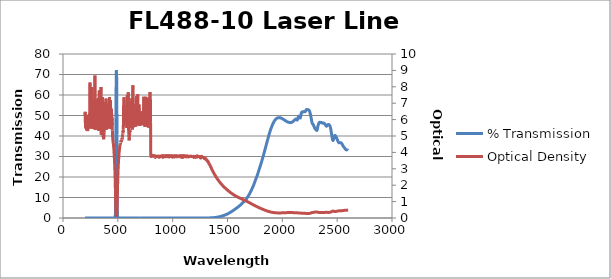
| Category | % Transmission |
|---|---|
| 2600.0 | 32.931 |
| 2599.0 | 32.979 |
| 2598.0 | 33.02 |
| 2597.0 | 33.05 |
| 2596.0 | 33.079 |
| 2595.0 | 33.104 |
| 2594.0 | 33.125 |
| 2593.0 | 33.148 |
| 2592.0 | 33.171 |
| 2591.0 | 33.188 |
| 2590.0 | 33.199 |
| 2589.0 | 33.204 |
| 2588.0 | 33.206 |
| 2587.0 | 33.207 |
| 2586.0 | 33.225 |
| 2585.0 | 33.237 |
| 2584.0 | 33.252 |
| 2583.0 | 33.273 |
| 2582.0 | 33.294 |
| 2581.0 | 33.32 |
| 2580.0 | 33.357 |
| 2579.0 | 33.407 |
| 2578.0 | 33.458 |
| 2577.0 | 33.515 |
| 2576.0 | 33.574 |
| 2575.0 | 33.638 |
| 2574.0 | 33.709 |
| 2573.0 | 33.794 |
| 2572.0 | 33.872 |
| 2571.0 | 33.949 |
| 2570.0 | 34.018 |
| 2569.0 | 34.081 |
| 2568.0 | 34.137 |
| 2567.0 | 34.196 |
| 2566.0 | 34.258 |
| 2565.0 | 34.32 |
| 2564.0 | 34.395 |
| 2563.0 | 34.468 |
| 2562.0 | 34.547 |
| 2561.0 | 34.618 |
| 2560.0 | 34.696 |
| 2559.0 | 34.767 |
| 2558.0 | 34.826 |
| 2557.0 | 34.89 |
| 2556.0 | 34.951 |
| 2555.0 | 35.021 |
| 2554.0 | 35.103 |
| 2553.0 | 35.191 |
| 2552.0 | 35.299 |
| 2551.0 | 35.409 |
| 2550.0 | 35.522 |
| 2549.0 | 35.629 |
| 2548.0 | 35.739 |
| 2547.0 | 35.849 |
| 2546.0 | 35.949 |
| 2545.0 | 36.046 |
| 2544.0 | 36.144 |
| 2543.0 | 36.235 |
| 2542.0 | 36.316 |
| 2541.0 | 36.394 |
| 2540.0 | 36.465 |
| 2539.0 | 36.526 |
| 2538.0 | 36.575 |
| 2537.0 | 36.626 |
| 2536.0 | 36.668 |
| 2535.0 | 36.699 |
| 2534.0 | 36.731 |
| 2533.0 | 36.75 |
| 2532.0 | 36.759 |
| 2531.0 | 36.76 |
| 2530.0 | 36.757 |
| 2529.0 | 36.748 |
| 2528.0 | 36.743 |
| 2527.0 | 36.736 |
| 2526.0 | 36.722 |
| 2525.0 | 36.717 |
| 2524.0 | 36.705 |
| 2523.0 | 36.699 |
| 2522.0 | 36.687 |
| 2521.0 | 36.68 |
| 2520.0 | 36.674 |
| 2519.0 | 36.674 |
| 2518.0 | 36.682 |
| 2517.0 | 36.692 |
| 2516.0 | 36.722 |
| 2515.0 | 36.753 |
| 2514.0 | 36.808 |
| 2513.0 | 36.857 |
| 2512.0 | 36.932 |
| 2511.0 | 37.014 |
| 2510.0 | 37.102 |
| 2509.0 | 37.205 |
| 2508.0 | 37.316 |
| 2507.0 | 37.436 |
| 2506.0 | 37.552 |
| 2505.0 | 37.694 |
| 2504.0 | 37.824 |
| 2503.0 | 37.965 |
| 2502.0 | 38.11 |
| 2501.0 | 38.254 |
| 2500.0 | 38.384 |
| 2499.0 | 38.514 |
| 2498.0 | 38.643 |
| 2497.0 | 38.751 |
| 2496.0 | 38.876 |
| 2495.0 | 38.981 |
| 2494.0 | 39.095 |
| 2493.0 | 39.186 |
| 2492.0 | 39.297 |
| 2491.0 | 39.389 |
| 2490.0 | 39.494 |
| 2489.0 | 39.596 |
| 2488.0 | 39.701 |
| 2487.0 | 39.801 |
| 2486.0 | 39.901 |
| 2485.0 | 40.003 |
| 2484.0 | 40.08 |
| 2483.0 | 40.166 |
| 2482.0 | 40.212 |
| 2481.0 | 40.249 |
| 2480.0 | 40.239 |
| 2479.0 | 40.225 |
| 2478.0 | 40.167 |
| 2477.0 | 40.09 |
| 2476.0 | 39.986 |
| 2475.0 | 39.868 |
| 2474.0 | 39.734 |
| 2473.0 | 39.576 |
| 2472.0 | 39.411 |
| 2471.0 | 39.221 |
| 2470.0 | 39.035 |
| 2469.0 | 38.821 |
| 2468.0 | 38.622 |
| 2467.0 | 38.41 |
| 2466.0 | 38.221 |
| 2465.0 | 38.041 |
| 2464.0 | 37.901 |
| 2463.0 | 37.807 |
| 2462.0 | 37.782 |
| 2461.0 | 37.809 |
| 2460.0 | 37.91 |
| 2459.0 | 38.071 |
| 2458.0 | 38.278 |
| 2457.0 | 38.533 |
| 2456.0 | 38.81 |
| 2455.0 | 39.1 |
| 2454.0 | 39.387 |
| 2453.0 | 39.696 |
| 2452.0 | 39.993 |
| 2451.0 | 40.307 |
| 2450.0 | 40.632 |
| 2449.0 | 40.955 |
| 2448.0 | 41.278 |
| 2447.0 | 41.609 |
| 2446.0 | 41.954 |
| 2445.0 | 42.287 |
| 2444.0 | 42.629 |
| 2443.0 | 42.957 |
| 2442.0 | 43.245 |
| 2441.0 | 43.528 |
| 2440.0 | 43.786 |
| 2439.0 | 44.015 |
| 2438.0 | 44.227 |
| 2437.0 | 44.417 |
| 2436.0 | 44.586 |
| 2435.0 | 44.724 |
| 2434.0 | 44.859 |
| 2433.0 | 44.972 |
| 2432.0 | 45.068 |
| 2431.0 | 45.163 |
| 2430.0 | 45.249 |
| 2429.0 | 45.314 |
| 2428.0 | 45.381 |
| 2427.0 | 45.442 |
| 2426.0 | 45.493 |
| 2425.0 | 45.531 |
| 2424.0 | 45.565 |
| 2423.0 | 45.593 |
| 2422.0 | 45.608 |
| 2421.0 | 45.621 |
| 2420.0 | 45.632 |
| 2419.0 | 45.631 |
| 2418.0 | 45.623 |
| 2417.0 | 45.612 |
| 2416.0 | 45.594 |
| 2415.0 | 45.563 |
| 2414.0 | 45.525 |
| 2413.0 | 45.477 |
| 2412.0 | 45.415 |
| 2411.0 | 45.341 |
| 2410.0 | 45.258 |
| 2409.0 | 45.171 |
| 2408.0 | 45.079 |
| 2407.0 | 44.993 |
| 2406.0 | 44.913 |
| 2405.0 | 44.843 |
| 2404.0 | 44.804 |
| 2403.0 | 44.784 |
| 2402.0 | 44.782 |
| 2401.0 | 44.819 |
| 2400.0 | 44.855 |
| 2399.0 | 44.925 |
| 2398.0 | 44.999 |
| 2397.0 | 45.083 |
| 2396.0 | 45.159 |
| 2395.0 | 45.252 |
| 2394.0 | 45.319 |
| 2393.0 | 45.403 |
| 2392.0 | 45.466 |
| 2391.0 | 45.548 |
| 2390.0 | 45.607 |
| 2389.0 | 45.688 |
| 2388.0 | 45.749 |
| 2387.0 | 45.832 |
| 2386.0 | 45.896 |
| 2385.0 | 45.985 |
| 2384.0 | 46.035 |
| 2383.0 | 46.125 |
| 2382.0 | 46.17 |
| 2381.0 | 46.238 |
| 2380.0 | 46.267 |
| 2379.0 | 46.308 |
| 2378.0 | 46.311 |
| 2377.0 | 46.34 |
| 2376.0 | 46.32 |
| 2375.0 | 46.333 |
| 2374.0 | 46.306 |
| 2373.0 | 46.314 |
| 2372.0 | 46.285 |
| 2371.0 | 46.293 |
| 2370.0 | 46.274 |
| 2369.0 | 46.288 |
| 2368.0 | 46.272 |
| 2367.0 | 46.288 |
| 2366.0 | 46.282 |
| 2365.0 | 46.296 |
| 2364.0 | 46.316 |
| 2363.0 | 46.361 |
| 2362.0 | 46.402 |
| 2361.0 | 46.459 |
| 2360.0 | 46.504 |
| 2359.0 | 46.548 |
| 2358.0 | 46.581 |
| 2357.0 | 46.594 |
| 2356.0 | 46.606 |
| 2355.0 | 46.591 |
| 2354.0 | 46.581 |
| 2353.0 | 46.543 |
| 2352.0 | 46.537 |
| 2351.0 | 46.509 |
| 2350.0 | 46.523 |
| 2349.0 | 46.519 |
| 2348.0 | 46.559 |
| 2347.0 | 46.568 |
| 2346.0 | 46.623 |
| 2345.0 | 46.632 |
| 2344.0 | 46.686 |
| 2343.0 | 46.68 |
| 2342.0 | 46.719 |
| 2341.0 | 46.701 |
| 2340.0 | 46.716 |
| 2339.0 | 46.675 |
| 2338.0 | 46.661 |
| 2337.0 | 46.588 |
| 2336.0 | 46.534 |
| 2335.0 | 46.431 |
| 2334.0 | 46.34 |
| 2333.0 | 46.212 |
| 2332.0 | 46.094 |
| 2331.0 | 45.953 |
| 2330.0 | 45.808 |
| 2329.0 | 45.66 |
| 2328.0 | 45.496 |
| 2327.0 | 45.33 |
| 2326.0 | 45.153 |
| 2325.0 | 44.959 |
| 2324.0 | 44.739 |
| 2323.0 | 44.503 |
| 2322.0 | 44.235 |
| 2321.0 | 43.955 |
| 2320.0 | 43.664 |
| 2319.0 | 43.397 |
| 2318.0 | 43.151 |
| 2317.0 | 42.948 |
| 2316.0 | 42.805 |
| 2315.0 | 42.711 |
| 2314.0 | 42.677 |
| 2313.0 | 42.693 |
| 2312.0 | 42.749 |
| 2311.0 | 42.817 |
| 2310.0 | 42.903 |
| 2309.0 | 42.994 |
| 2308.0 | 43.075 |
| 2307.0 | 43.135 |
| 2306.0 | 43.194 |
| 2305.0 | 43.222 |
| 2304.0 | 43.262 |
| 2303.0 | 43.284 |
| 2302.0 | 43.328 |
| 2301.0 | 43.373 |
| 2300.0 | 43.436 |
| 2299.0 | 43.507 |
| 2298.0 | 43.603 |
| 2297.0 | 43.693 |
| 2296.0 | 43.81 |
| 2295.0 | 43.928 |
| 2294.0 | 44.041 |
| 2293.0 | 44.161 |
| 2292.0 | 44.278 |
| 2291.0 | 44.409 |
| 2290.0 | 44.525 |
| 2289.0 | 44.658 |
| 2288.0 | 44.779 |
| 2287.0 | 44.913 |
| 2286.0 | 45.038 |
| 2285.0 | 45.172 |
| 2284.0 | 45.296 |
| 2283.0 | 45.42 |
| 2282.0 | 45.528 |
| 2281.0 | 45.617 |
| 2280.0 | 45.69 |
| 2279.0 | 45.746 |
| 2278.0 | 45.793 |
| 2277.0 | 45.833 |
| 2276.0 | 45.881 |
| 2275.0 | 45.94 |
| 2274.0 | 46.023 |
| 2273.0 | 46.138 |
| 2272.0 | 46.281 |
| 2271.0 | 46.478 |
| 2270.0 | 46.706 |
| 2269.0 | 46.971 |
| 2268.0 | 47.245 |
| 2267.0 | 47.54 |
| 2266.0 | 47.838 |
| 2265.0 | 48.135 |
| 2264.0 | 48.438 |
| 2263.0 | 48.74 |
| 2262.0 | 49.024 |
| 2261.0 | 49.302 |
| 2260.0 | 49.566 |
| 2259.0 | 49.824 |
| 2258.0 | 50.073 |
| 2257.0 | 50.323 |
| 2256.0 | 50.564 |
| 2255.0 | 50.786 |
| 2254.0 | 51.01 |
| 2253.0 | 51.217 |
| 2252.0 | 51.413 |
| 2251.0 | 51.605 |
| 2250.0 | 51.78 |
| 2249.0 | 51.942 |
| 2248.0 | 52.083 |
| 2247.0 | 52.214 |
| 2246.0 | 52.331 |
| 2245.0 | 52.43 |
| 2244.0 | 52.519 |
| 2243.0 | 52.589 |
| 2242.0 | 52.649 |
| 2241.0 | 52.694 |
| 2240.0 | 52.728 |
| 2239.0 | 52.755 |
| 2238.0 | 52.767 |
| 2237.0 | 52.775 |
| 2236.0 | 52.775 |
| 2235.0 | 52.779 |
| 2234.0 | 52.779 |
| 2233.0 | 52.785 |
| 2232.0 | 52.792 |
| 2231.0 | 52.807 |
| 2230.0 | 52.829 |
| 2229.0 | 52.856 |
| 2228.0 | 52.885 |
| 2227.0 | 52.911 |
| 2226.0 | 52.946 |
| 2225.0 | 52.961 |
| 2224.0 | 52.97 |
| 2223.0 | 52.976 |
| 2222.0 | 52.964 |
| 2221.0 | 52.935 |
| 2220.0 | 52.89 |
| 2219.0 | 52.836 |
| 2218.0 | 52.756 |
| 2217.0 | 52.672 |
| 2216.0 | 52.579 |
| 2215.0 | 52.466 |
| 2214.0 | 52.36 |
| 2213.0 | 52.253 |
| 2212.0 | 52.147 |
| 2211.0 | 52.049 |
| 2210.0 | 51.972 |
| 2209.0 | 51.911 |
| 2208.0 | 51.86 |
| 2207.0 | 51.836 |
| 2206.0 | 51.822 |
| 2205.0 | 51.819 |
| 2204.0 | 51.829 |
| 2203.0 | 51.855 |
| 2202.0 | 51.88 |
| 2201.0 | 51.901 |
| 2200.0 | 51.93 |
| 2199.0 | 51.945 |
| 2198.0 | 51.954 |
| 2197.0 | 51.952 |
| 2196.0 | 51.938 |
| 2195.0 | 51.915 |
| 2194.0 | 51.878 |
| 2193.0 | 51.846 |
| 2192.0 | 51.806 |
| 2191.0 | 51.766 |
| 2190.0 | 51.735 |
| 2189.0 | 51.712 |
| 2188.0 | 51.7 |
| 2187.0 | 51.7 |
| 2186.0 | 51.705 |
| 2185.0 | 51.718 |
| 2184.0 | 51.736 |
| 2183.0 | 51.745 |
| 2182.0 | 51.753 |
| 2181.0 | 51.747 |
| 2180.0 | 51.731 |
| 2179.0 | 51.696 |
| 2178.0 | 51.652 |
| 2177.0 | 51.582 |
| 2176.0 | 51.493 |
| 2175.0 | 51.382 |
| 2174.0 | 51.238 |
| 2173.0 | 51.064 |
| 2172.0 | 50.859 |
| 2171.0 | 50.625 |
| 2170.0 | 50.362 |
| 2169.0 | 50.066 |
| 2168.0 | 49.785 |
| 2167.0 | 49.495 |
| 2166.0 | 49.231 |
| 2165.0 | 49.027 |
| 2164.0 | 48.867 |
| 2163.0 | 48.767 |
| 2162.0 | 48.733 |
| 2161.0 | 48.751 |
| 2160.0 | 48.826 |
| 2159.0 | 48.921 |
| 2158.0 | 49.039 |
| 2157.0 | 49.171 |
| 2156.0 | 49.297 |
| 2155.0 | 49.416 |
| 2154.0 | 49.516 |
| 2153.0 | 49.593 |
| 2152.0 | 49.642 |
| 2151.0 | 49.665 |
| 2150.0 | 49.659 |
| 2149.0 | 49.628 |
| 2148.0 | 49.568 |
| 2147.0 | 49.481 |
| 2146.0 | 49.372 |
| 2145.0 | 49.238 |
| 2144.0 | 49.082 |
| 2143.0 | 48.91 |
| 2142.0 | 48.731 |
| 2141.0 | 48.532 |
| 2140.0 | 48.344 |
| 2139.0 | 48.171 |
| 2138.0 | 48.009 |
| 2137.0 | 47.879 |
| 2136.0 | 47.79 |
| 2135.0 | 47.749 |
| 2134.0 | 47.751 |
| 2133.0 | 47.797 |
| 2132.0 | 47.867 |
| 2131.0 | 47.961 |
| 2130.0 | 48.054 |
| 2129.0 | 48.147 |
| 2128.0 | 48.222 |
| 2127.0 | 48.275 |
| 2126.0 | 48.304 |
| 2125.0 | 48.309 |
| 2124.0 | 48.299 |
| 2123.0 | 48.276 |
| 2122.0 | 48.241 |
| 2121.0 | 48.195 |
| 2120.0 | 48.16 |
| 2119.0 | 48.124 |
| 2118.0 | 48.08 |
| 2117.0 | 48.041 |
| 2116.0 | 47.999 |
| 2115.0 | 47.957 |
| 2114.0 | 47.909 |
| 2113.0 | 47.865 |
| 2112.0 | 47.815 |
| 2111.0 | 47.763 |
| 2110.0 | 47.718 |
| 2109.0 | 47.667 |
| 2108.0 | 47.62 |
| 2107.0 | 47.577 |
| 2106.0 | 47.524 |
| 2105.0 | 47.475 |
| 2104.0 | 47.425 |
| 2103.0 | 47.377 |
| 2102.0 | 47.327 |
| 2101.0 | 47.274 |
| 2100.0 | 47.226 |
| 2099.0 | 47.178 |
| 2098.0 | 47.126 |
| 2097.0 | 47.083 |
| 2096.0 | 47.034 |
| 2095.0 | 46.989 |
| 2094.0 | 46.946 |
| 2093.0 | 46.908 |
| 2092.0 | 46.864 |
| 2091.0 | 46.832 |
| 2090.0 | 46.793 |
| 2089.0 | 46.761 |
| 2088.0 | 46.73 |
| 2087.0 | 46.702 |
| 2086.0 | 46.676 |
| 2085.0 | 46.656 |
| 2084.0 | 46.637 |
| 2083.0 | 46.616 |
| 2082.0 | 46.607 |
| 2081.0 | 46.589 |
| 2080.0 | 46.585 |
| 2079.0 | 46.574 |
| 2078.0 | 46.566 |
| 2077.0 | 46.566 |
| 2076.0 | 46.561 |
| 2075.0 | 46.561 |
| 2074.0 | 46.564 |
| 2073.0 | 46.564 |
| 2072.0 | 46.562 |
| 2071.0 | 46.575 |
| 2070.0 | 46.576 |
| 2069.0 | 46.579 |
| 2068.0 | 46.596 |
| 2067.0 | 46.599 |
| 2066.0 | 46.605 |
| 2065.0 | 46.617 |
| 2064.0 | 46.632 |
| 2063.0 | 46.639 |
| 2062.0 | 46.655 |
| 2061.0 | 46.668 |
| 2060.0 | 46.679 |
| 2059.0 | 46.697 |
| 2058.0 | 46.71 |
| 2057.0 | 46.723 |
| 2056.0 | 46.741 |
| 2055.0 | 46.753 |
| 2054.0 | 46.772 |
| 2053.0 | 46.792 |
| 2052.0 | 46.804 |
| 2051.0 | 46.819 |
| 2050.0 | 46.838 |
| 2049.0 | 46.862 |
| 2048.0 | 46.881 |
| 2047.0 | 46.899 |
| 2046.0 | 46.918 |
| 2045.0 | 46.938 |
| 2044.0 | 46.962 |
| 2043.0 | 46.987 |
| 2042.0 | 47.014 |
| 2041.0 | 47.039 |
| 2040.0 | 47.065 |
| 2039.0 | 47.093 |
| 2038.0 | 47.13 |
| 2037.0 | 47.166 |
| 2036.0 | 47.197 |
| 2035.0 | 47.228 |
| 2034.0 | 47.264 |
| 2033.0 | 47.304 |
| 2032.0 | 47.337 |
| 2031.0 | 47.377 |
| 2030.0 | 47.404 |
| 2029.0 | 47.442 |
| 2028.0 | 47.477 |
| 2027.0 | 47.507 |
| 2026.0 | 47.543 |
| 2025.0 | 47.582 |
| 2024.0 | 47.617 |
| 2023.0 | 47.645 |
| 2022.0 | 47.686 |
| 2021.0 | 47.718 |
| 2020.0 | 47.752 |
| 2019.0 | 47.783 |
| 2018.0 | 47.826 |
| 2017.0 | 47.856 |
| 2016.0 | 47.891 |
| 2015.0 | 47.929 |
| 2014.0 | 47.96 |
| 2013.0 | 47.995 |
| 2012.0 | 48.034 |
| 2011.0 | 48.072 |
| 2010.0 | 48.096 |
| 2009.0 | 48.138 |
| 2008.0 | 48.172 |
| 2007.0 | 48.208 |
| 2006.0 | 48.245 |
| 2005.0 | 48.276 |
| 2004.0 | 48.312 |
| 2003.0 | 48.343 |
| 2002.0 | 48.379 |
| 2001.0 | 48.405 |
| 2000.0 | 48.438 |
| 1999.0 | 48.469 |
| 1998.0 | 48.504 |
| 1997.0 | 48.529 |
| 1996.0 | 48.556 |
| 1995.0 | 48.578 |
| 1994.0 | 48.608 |
| 1993.0 | 48.636 |
| 1992.0 | 48.663 |
| 1991.0 | 48.688 |
| 1990.0 | 48.713 |
| 1989.0 | 48.738 |
| 1988.0 | 48.757 |
| 1987.0 | 48.787 |
| 1986.0 | 48.801 |
| 1985.0 | 48.823 |
| 1984.0 | 48.843 |
| 1983.0 | 48.854 |
| 1982.0 | 48.865 |
| 1981.0 | 48.883 |
| 1980.0 | 48.893 |
| 1979.0 | 48.906 |
| 1978.0 | 48.908 |
| 1977.0 | 48.926 |
| 1976.0 | 48.93 |
| 1975.0 | 48.933 |
| 1974.0 | 48.938 |
| 1973.0 | 48.937 |
| 1972.0 | 48.943 |
| 1971.0 | 48.942 |
| 1970.0 | 48.944 |
| 1969.0 | 48.938 |
| 1968.0 | 48.939 |
| 1967.0 | 48.94 |
| 1966.0 | 48.934 |
| 1965.0 | 48.925 |
| 1964.0 | 48.923 |
| 1963.0 | 48.909 |
| 1962.0 | 48.905 |
| 1961.0 | 48.884 |
| 1960.0 | 48.876 |
| 1959.0 | 48.859 |
| 1958.0 | 48.848 |
| 1957.0 | 48.824 |
| 1956.0 | 48.805 |
| 1955.0 | 48.782 |
| 1954.0 | 48.756 |
| 1953.0 | 48.727 |
| 1952.0 | 48.697 |
| 1951.0 | 48.667 |
| 1950.0 | 48.635 |
| 1949.0 | 48.6 |
| 1948.0 | 48.559 |
| 1947.0 | 48.522 |
| 1946.0 | 48.48 |
| 1945.0 | 48.435 |
| 1944.0 | 48.387 |
| 1943.0 | 48.337 |
| 1942.0 | 48.282 |
| 1941.0 | 48.231 |
| 1940.0 | 48.178 |
| 1939.0 | 48.117 |
| 1938.0 | 48.057 |
| 1937.0 | 47.995 |
| 1936.0 | 47.937 |
| 1935.0 | 47.87 |
| 1934.0 | 47.8 |
| 1933.0 | 47.734 |
| 1932.0 | 47.662 |
| 1931.0 | 47.591 |
| 1930.0 | 47.512 |
| 1929.0 | 47.428 |
| 1928.0 | 47.348 |
| 1927.0 | 47.258 |
| 1926.0 | 47.174 |
| 1925.0 | 47.085 |
| 1924.0 | 47.002 |
| 1923.0 | 46.908 |
| 1922.0 | 46.817 |
| 1921.0 | 46.719 |
| 1920.0 | 46.61 |
| 1919.0 | 46.505 |
| 1918.0 | 46.397 |
| 1917.0 | 46.3 |
| 1916.0 | 46.193 |
| 1915.0 | 46.08 |
| 1914.0 | 45.968 |
| 1913.0 | 45.839 |
| 1912.0 | 45.714 |
| 1911.0 | 45.589 |
| 1910.0 | 45.466 |
| 1909.0 | 45.343 |
| 1908.0 | 45.231 |
| 1907.0 | 45.116 |
| 1906.0 | 44.977 |
| 1905.0 | 44.835 |
| 1904.0 | 44.692 |
| 1903.0 | 44.557 |
| 1902.0 | 44.434 |
| 1901.0 | 44.294 |
| 1900.0 | 44.15 |
| 1899.0 | 43.993 |
| 1898.0 | 43.836 |
| 1897.0 | 43.685 |
| 1896.0 | 43.539 |
| 1895.0 | 43.397 |
| 1894.0 | 43.242 |
| 1893.0 | 43.083 |
| 1892.0 | 42.929 |
| 1891.0 | 42.765 |
| 1890.0 | 42.59 |
| 1889.0 | 42.423 |
| 1888.0 | 42.264 |
| 1887.0 | 42.1 |
| 1886.0 | 41.933 |
| 1885.0 | 41.762 |
| 1884.0 | 41.575 |
| 1883.0 | 41.393 |
| 1882.0 | 41.211 |
| 1881.0 | 41.036 |
| 1880.0 | 40.843 |
| 1879.0 | 40.675 |
| 1878.0 | 40.491 |
| 1877.0 | 40.301 |
| 1876.0 | 40.116 |
| 1875.0 | 39.944 |
| 1874.0 | 39.766 |
| 1873.0 | 39.577 |
| 1872.0 | 39.367 |
| 1871.0 | 39.143 |
| 1870.0 | 38.953 |
| 1869.0 | 38.77 |
| 1868.0 | 38.573 |
| 1867.0 | 38.376 |
| 1866.0 | 38.188 |
| 1865.0 | 37.995 |
| 1864.0 | 37.803 |
| 1863.0 | 37.607 |
| 1862.0 | 37.429 |
| 1861.0 | 37.239 |
| 1860.0 | 37.025 |
| 1859.0 | 36.802 |
| 1858.0 | 36.596 |
| 1857.0 | 36.407 |
| 1856.0 | 36.209 |
| 1855.0 | 36.009 |
| 1854.0 | 35.799 |
| 1853.0 | 35.588 |
| 1852.0 | 35.376 |
| 1851.0 | 35.185 |
| 1850.0 | 35.014 |
| 1849.0 | 34.827 |
| 1848.0 | 34.615 |
| 1847.0 | 34.381 |
| 1846.0 | 34.15 |
| 1845.0 | 33.969 |
| 1844.0 | 33.8 |
| 1843.0 | 33.621 |
| 1842.0 | 33.415 |
| 1841.0 | 33.203 |
| 1840.0 | 32.996 |
| 1839.0 | 32.805 |
| 1838.0 | 32.625 |
| 1837.0 | 32.426 |
| 1836.0 | 32.209 |
| 1835.0 | 31.991 |
| 1834.0 | 31.798 |
| 1833.0 | 31.606 |
| 1832.0 | 31.41 |
| 1831.0 | 31.204 |
| 1830.0 | 31.008 |
| 1829.0 | 30.798 |
| 1828.0 | 30.625 |
| 1827.0 | 30.425 |
| 1826.0 | 30.225 |
| 1825.0 | 30.027 |
| 1824.0 | 29.855 |
| 1823.0 | 29.69 |
| 1822.0 | 29.504 |
| 1821.0 | 29.312 |
| 1820.0 | 29.101 |
| 1819.0 | 28.921 |
| 1818.0 | 28.747 |
| 1817.0 | 28.582 |
| 1816.0 | 28.388 |
| 1815.0 | 28.202 |
| 1814.0 | 28.02 |
| 1813.0 | 27.835 |
| 1812.0 | 27.66 |
| 1811.0 | 27.474 |
| 1810.0 | 27.296 |
| 1809.0 | 27.121 |
| 1808.0 | 26.951 |
| 1807.0 | 26.775 |
| 1806.0 | 26.591 |
| 1805.0 | 26.424 |
| 1804.0 | 26.246 |
| 1803.0 | 26.085 |
| 1802.0 | 25.911 |
| 1801.0 | 25.733 |
| 1800.0 | 25.557 |
| 1799.0 | 25.383 |
| 1798.0 | 25.225 |
| 1797.0 | 25.045 |
| 1796.0 | 24.887 |
| 1795.0 | 24.708 |
| 1794.0 | 24.538 |
| 1793.0 | 24.366 |
| 1792.0 | 24.2 |
| 1791.0 | 24.037 |
| 1790.0 | 23.869 |
| 1789.0 | 23.712 |
| 1788.0 | 23.539 |
| 1787.0 | 23.376 |
| 1786.0 | 23.214 |
| 1785.0 | 23.051 |
| 1784.0 | 22.894 |
| 1783.0 | 22.731 |
| 1782.0 | 22.565 |
| 1781.0 | 22.4 |
| 1780.0 | 22.236 |
| 1779.0 | 22.077 |
| 1778.0 | 21.906 |
| 1777.0 | 21.744 |
| 1776.0 | 21.579 |
| 1775.0 | 21.408 |
| 1774.0 | 21.248 |
| 1773.0 | 21.085 |
| 1772.0 | 20.928 |
| 1771.0 | 20.766 |
| 1770.0 | 20.616 |
| 1769.0 | 20.462 |
| 1768.0 | 20.309 |
| 1767.0 | 20.168 |
| 1766.0 | 20.027 |
| 1765.0 | 19.887 |
| 1764.0 | 19.744 |
| 1763.0 | 19.608 |
| 1762.0 | 19.466 |
| 1761.0 | 19.324 |
| 1760.0 | 19.188 |
| 1759.0 | 19.048 |
| 1758.0 | 18.91 |
| 1757.0 | 18.771 |
| 1756.0 | 18.627 |
| 1755.0 | 18.484 |
| 1754.0 | 18.343 |
| 1753.0 | 18.203 |
| 1752.0 | 18.051 |
| 1751.0 | 17.916 |
| 1750.0 | 17.764 |
| 1749.0 | 17.619 |
| 1748.0 | 17.474 |
| 1747.0 | 17.332 |
| 1746.0 | 17.186 |
| 1745.0 | 17.038 |
| 1744.0 | 16.895 |
| 1743.0 | 16.737 |
| 1742.0 | 16.588 |
| 1741.0 | 16.452 |
| 1740.0 | 16.308 |
| 1739.0 | 16.169 |
| 1738.0 | 16.036 |
| 1737.0 | 15.901 |
| 1736.0 | 15.768 |
| 1735.0 | 15.645 |
| 1734.0 | 15.52 |
| 1733.0 | 15.401 |
| 1732.0 | 15.284 |
| 1731.0 | 15.163 |
| 1730.0 | 15.042 |
| 1729.0 | 14.925 |
| 1728.0 | 14.808 |
| 1727.0 | 14.688 |
| 1726.0 | 14.565 |
| 1725.0 | 14.452 |
| 1724.0 | 14.327 |
| 1723.0 | 14.203 |
| 1722.0 | 14.095 |
| 1721.0 | 13.978 |
| 1720.0 | 13.865 |
| 1719.0 | 13.756 |
| 1718.0 | 13.648 |
| 1717.0 | 13.541 |
| 1716.0 | 13.432 |
| 1715.0 | 13.333 |
| 1714.0 | 13.224 |
| 1713.0 | 13.114 |
| 1712.0 | 13.006 |
| 1711.0 | 12.89 |
| 1710.0 | 12.777 |
| 1709.0 | 12.667 |
| 1708.0 | 12.551 |
| 1707.0 | 12.435 |
| 1706.0 | 12.323 |
| 1705.0 | 12.208 |
| 1704.0 | 12.089 |
| 1703.0 | 11.975 |
| 1702.0 | 11.862 |
| 1701.0 | 11.752 |
| 1700.0 | 11.65 |
| 1699.0 | 11.551 |
| 1698.0 | 11.46 |
| 1697.0 | 11.375 |
| 1696.0 | 11.293 |
| 1695.0 | 11.21 |
| 1694.0 | 11.122 |
| 1693.0 | 11.036 |
| 1692.0 | 10.939 |
| 1691.0 | 10.843 |
| 1690.0 | 10.747 |
| 1689.0 | 10.662 |
| 1688.0 | 10.577 |
| 1687.0 | 10.501 |
| 1686.0 | 10.428 |
| 1685.0 | 10.359 |
| 1684.0 | 10.292 |
| 1683.0 | 10.222 |
| 1682.0 | 10.155 |
| 1681.0 | 10.081 |
| 1680.0 | 10.001 |
| 1679.0 | 9.915 |
| 1678.0 | 9.827 |
| 1677.0 | 9.736 |
| 1676.0 | 9.64 |
| 1675.0 | 9.545 |
| 1674.0 | 9.451 |
| 1673.0 | 9.361 |
| 1672.0 | 9.269 |
| 1671.0 | 9.186 |
| 1670.0 | 9.109 |
| 1669.0 | 9.042 |
| 1668.0 | 8.98 |
| 1667.0 | 8.922 |
| 1666.0 | 8.873 |
| 1665.0 | 8.828 |
| 1664.0 | 8.787 |
| 1663.0 | 8.741 |
| 1662.0 | 8.694 |
| 1661.0 | 8.649 |
| 1660.0 | 8.6 |
| 1659.0 | 8.542 |
| 1658.0 | 8.49 |
| 1657.0 | 8.432 |
| 1656.0 | 8.375 |
| 1655.0 | 8.315 |
| 1654.0 | 8.255 |
| 1653.0 | 8.188 |
| 1652.0 | 8.126 |
| 1651.0 | 8.066 |
| 1650.0 | 8.001 |
| 1649.0 | 7.936 |
| 1648.0 | 7.875 |
| 1647.0 | 7.816 |
| 1646.0 | 7.762 |
| 1645.0 | 7.706 |
| 1644.0 | 7.653 |
| 1643.0 | 7.599 |
| 1642.0 | 7.549 |
| 1641.0 | 7.496 |
| 1640.0 | 7.438 |
| 1639.0 | 7.387 |
| 1638.0 | 7.337 |
| 1637.0 | 7.282 |
| 1636.0 | 7.229 |
| 1635.0 | 7.176 |
| 1634.0 | 7.122 |
| 1633.0 | 7.07 |
| 1632.0 | 7.02 |
| 1631.0 | 6.971 |
| 1630.0 | 6.922 |
| 1629.0 | 6.87 |
| 1628.0 | 6.819 |
| 1627.0 | 6.77 |
| 1626.0 | 6.722 |
| 1625.0 | 6.673 |
| 1624.0 | 6.624 |
| 1623.0 | 6.576 |
| 1622.0 | 6.525 |
| 1621.0 | 6.477 |
| 1620.0 | 6.426 |
| 1619.0 | 6.378 |
| 1618.0 | 6.331 |
| 1617.0 | 6.287 |
| 1616.0 | 6.243 |
| 1615.0 | 6.197 |
| 1614.0 | 6.151 |
| 1613.0 | 6.109 |
| 1612.0 | 6.065 |
| 1611.0 | 6.018 |
| 1610.0 | 5.976 |
| 1609.0 | 5.928 |
| 1608.0 | 5.886 |
| 1607.0 | 5.843 |
| 1606.0 | 5.8 |
| 1605.0 | 5.756 |
| 1604.0 | 5.713 |
| 1603.0 | 5.671 |
| 1602.0 | 5.629 |
| 1601.0 | 5.585 |
| 1600.0 | 5.544 |
| 1599.0 | 5.503 |
| 1598.0 | 5.462 |
| 1597.0 | 5.424 |
| 1596.0 | 5.382 |
| 1595.0 | 5.341 |
| 1594.0 | 5.301 |
| 1593.0 | 5.259 |
| 1592.0 | 5.218 |
| 1591.0 | 5.179 |
| 1590.0 | 5.137 |
| 1589.0 | 5.096 |
| 1588.0 | 5.055 |
| 1587.0 | 5.017 |
| 1586.0 | 4.976 |
| 1585.0 | 4.938 |
| 1584.0 | 4.899 |
| 1583.0 | 4.859 |
| 1582.0 | 4.82 |
| 1581.0 | 4.782 |
| 1580.0 | 4.743 |
| 1579.0 | 4.704 |
| 1578.0 | 4.664 |
| 1577.0 | 4.626 |
| 1576.0 | 4.587 |
| 1575.0 | 4.549 |
| 1574.0 | 4.508 |
| 1573.0 | 4.468 |
| 1572.0 | 4.433 |
| 1571.0 | 4.393 |
| 1570.0 | 4.356 |
| 1569.0 | 4.314 |
| 1568.0 | 4.28 |
| 1567.0 | 4.244 |
| 1566.0 | 4.206 |
| 1565.0 | 4.168 |
| 1564.0 | 4.129 |
| 1563.0 | 4.09 |
| 1562.0 | 4.05 |
| 1561.0 | 4.018 |
| 1560.0 | 3.975 |
| 1559.0 | 3.937 |
| 1558.0 | 3.9 |
| 1557.0 | 3.86 |
| 1556.0 | 3.82 |
| 1555.0 | 3.783 |
| 1554.0 | 3.746 |
| 1553.0 | 3.708 |
| 1552.0 | 3.67 |
| 1551.0 | 3.634 |
| 1550.0 | 3.593 |
| 1549.0 | 3.559 |
| 1548.0 | 3.52 |
| 1547.0 | 3.486 |
| 1546.0 | 3.448 |
| 1545.0 | 3.41 |
| 1544.0 | 3.371 |
| 1543.0 | 3.334 |
| 1542.0 | 3.3 |
| 1541.0 | 3.266 |
| 1540.0 | 3.233 |
| 1539.0 | 3.194 |
| 1538.0 | 3.162 |
| 1537.0 | 3.126 |
| 1536.0 | 3.092 |
| 1535.0 | 3.06 |
| 1534.0 | 3.026 |
| 1533.0 | 2.992 |
| 1532.0 | 2.959 |
| 1531.0 | 2.922 |
| 1530.0 | 2.893 |
| 1529.0 | 2.856 |
| 1528.0 | 2.825 |
| 1527.0 | 2.793 |
| 1526.0 | 2.76 |
| 1525.0 | 2.729 |
| 1524.0 | 2.695 |
| 1523.0 | 2.668 |
| 1522.0 | 2.635 |
| 1521.0 | 2.605 |
| 1520.0 | 2.574 |
| 1519.0 | 2.54 |
| 1518.0 | 2.51 |
| 1517.0 | 2.48 |
| 1516.0 | 2.448 |
| 1515.0 | 2.419 |
| 1514.0 | 2.392 |
| 1513.0 | 2.361 |
| 1512.0 | 2.332 |
| 1511.0 | 2.304 |
| 1510.0 | 2.274 |
| 1509.0 | 2.247 |
| 1508.0 | 2.216 |
| 1507.0 | 2.187 |
| 1506.0 | 2.161 |
| 1505.0 | 2.134 |
| 1504.0 | 2.104 |
| 1503.0 | 2.078 |
| 1502.0 | 2.05 |
| 1501.0 | 2.024 |
| 1500.0 | 1.996 |
| 1499.0 | 1.969 |
| 1498.0 | 1.946 |
| 1497.0 | 1.917 |
| 1496.0 | 1.894 |
| 1495.0 | 1.87 |
| 1494.0 | 1.842 |
| 1493.0 | 1.817 |
| 1492.0 | 1.794 |
| 1491.0 | 1.768 |
| 1490.0 | 1.745 |
| 1489.0 | 1.722 |
| 1488.0 | 1.696 |
| 1487.0 | 1.676 |
| 1486.0 | 1.65 |
| 1485.0 | 1.631 |
| 1484.0 | 1.605 |
| 1483.0 | 1.584 |
| 1482.0 | 1.561 |
| 1481.0 | 1.538 |
| 1480.0 | 1.516 |
| 1479.0 | 1.493 |
| 1478.0 | 1.474 |
| 1477.0 | 1.454 |
| 1476.0 | 1.432 |
| 1475.0 | 1.411 |
| 1474.0 | 1.391 |
| 1473.0 | 1.371 |
| 1472.0 | 1.352 |
| 1471.0 | 1.333 |
| 1470.0 | 1.312 |
| 1469.0 | 1.292 |
| 1468.0 | 1.272 |
| 1467.0 | 1.253 |
| 1466.0 | 1.235 |
| 1465.0 | 1.214 |
| 1464.0 | 1.197 |
| 1463.0 | 1.178 |
| 1462.0 | 1.16 |
| 1461.0 | 1.141 |
| 1460.0 | 1.123 |
| 1459.0 | 1.104 |
| 1458.0 | 1.088 |
| 1457.0 | 1.071 |
| 1456.0 | 1.053 |
| 1455.0 | 1.038 |
| 1454.0 | 1.018 |
| 1453.0 | 1 |
| 1452.0 | 0.988 |
| 1451.0 | 0.968 |
| 1450.0 | 0.951 |
| 1449.0 | 0.936 |
| 1448.0 | 0.92 |
| 1447.0 | 0.905 |
| 1446.0 | 0.888 |
| 1445.0 | 0.873 |
| 1444.0 | 0.857 |
| 1443.0 | 0.841 |
| 1442.0 | 0.825 |
| 1441.0 | 0.81 |
| 1440.0 | 0.796 |
| 1439.0 | 0.782 |
| 1438.0 | 0.768 |
| 1437.0 | 0.751 |
| 1436.0 | 0.738 |
| 1435.0 | 0.723 |
| 1434.0 | 0.71 |
| 1433.0 | 0.697 |
| 1432.0 | 0.683 |
| 1431.0 | 0.67 |
| 1430.0 | 0.657 |
| 1429.0 | 0.646 |
| 1428.0 | 0.633 |
| 1427.0 | 0.621 |
| 1426.0 | 0.609 |
| 1425.0 | 0.596 |
| 1424.0 | 0.585 |
| 1423.0 | 0.574 |
| 1422.0 | 0.56 |
| 1421.0 | 0.553 |
| 1420.0 | 0.538 |
| 1419.0 | 0.53 |
| 1418.0 | 0.52 |
| 1417.0 | 0.509 |
| 1416.0 | 0.496 |
| 1415.0 | 0.487 |
| 1414.0 | 0.476 |
| 1413.0 | 0.466 |
| 1412.0 | 0.456 |
| 1411.0 | 0.448 |
| 1410.0 | 0.441 |
| 1409.0 | 0.43 |
| 1408.0 | 0.421 |
| 1407.0 | 0.409 |
| 1406.0 | 0.4 |
| 1405.0 | 0.392 |
| 1404.0 | 0.383 |
| 1403.0 | 0.371 |
| 1402.0 | 0.364 |
| 1401.0 | 0.359 |
| 1400.0 | 0.349 |
| 1399.0 | 0.34 |
| 1398.0 | 0.332 |
| 1397.0 | 0.326 |
| 1396.0 | 0.319 |
| 1395.0 | 0.309 |
| 1394.0 | 0.298 |
| 1393.0 | 0.289 |
| 1392.0 | 0.287 |
| 1391.0 | 0.278 |
| 1390.0 | 0.271 |
| 1389.0 | 0.267 |
| 1388.0 | 0.261 |
| 1387.0 | 0.251 |
| 1386.0 | 0.246 |
| 1385.0 | 0.239 |
| 1384.0 | 0.231 |
| 1383.0 | 0.227 |
| 1382.0 | 0.22 |
| 1381.0 | 0.215 |
| 1380.0 | 0.208 |
| 1379.0 | 0.205 |
| 1378.0 | 0.197 |
| 1377.0 | 0.191 |
| 1376.0 | 0.187 |
| 1375.0 | 0.182 |
| 1374.0 | 0.178 |
| 1373.0 | 0.172 |
| 1372.0 | 0.166 |
| 1371.0 | 0.162 |
| 1370.0 | 0.157 |
| 1369.0 | 0.155 |
| 1368.0 | 0.148 |
| 1367.0 | 0.143 |
| 1366.0 | 0.141 |
| 1365.0 | 0.135 |
| 1364.0 | 0.132 |
| 1363.0 | 0.128 |
| 1362.0 | 0.125 |
| 1361.0 | 0.12 |
| 1360.0 | 0.116 |
| 1359.0 | 0.112 |
| 1358.0 | 0.108 |
| 1357.0 | 0.107 |
| 1356.0 | 0.103 |
| 1355.0 | 0.098 |
| 1354.0 | 0.093 |
| 1353.0 | 0.092 |
| 1352.0 | 0.089 |
| 1351.0 | 0.087 |
| 1350.0 | 0.083 |
| 1349.0 | 0.08 |
| 1348.0 | 0.079 |
| 1347.0 | 0.073 |
| 1346.0 | 0.076 |
| 1345.0 | 0.071 |
| 1344.0 | 0.07 |
| 1343.0 | 0.066 |
| 1342.0 | 0.063 |
| 1341.0 | 0.063 |
| 1340.0 | 0.061 |
| 1339.0 | 0.057 |
| 1338.0 | 0.055 |
| 1337.0 | 0.056 |
| 1336.0 | 0.055 |
| 1335.0 | 0.053 |
| 1334.0 | 0.054 |
| 1333.0 | 0.047 |
| 1332.0 | 0.049 |
| 1331.0 | 0.048 |
| 1330.0 | 0.045 |
| 1329.0 | 0.044 |
| 1328.0 | 0.042 |
| 1327.0 | 0.041 |
| 1326.0 | 0.041 |
| 1325.0 | 0.039 |
| 1324.0 | 0.039 |
| 1323.0 | 0.036 |
| 1322.0 | 0.035 |
| 1321.0 | 0.036 |
| 1320.0 | 0.037 |
| 1319.0 | 0.032 |
| 1318.0 | 0.034 |
| 1317.0 | 0.033 |
| 1316.0 | 0.03 |
| 1315.0 | 0.033 |
| 1314.0 | 0.03 |
| 1313.0 | 0.031 |
| 1312.0 | 0.03 |
| 1311.0 | 0.029 |
| 1310.0 | 0.029 |
| 1309.0 | 0.028 |
| 1308.0 | 0.029 |
| 1307.0 | 0.026 |
| 1306.0 | 0.028 |
| 1305.0 | 0.028 |
| 1304.0 | 0.028 |
| 1303.0 | 0.026 |
| 1302.0 | 0.025 |
| 1301.0 | 0.024 |
| 1300.0 | 0.025 |
| 1299.0 | 0.024 |
| 1298.0 | 0.02 |
| 1297.0 | 0.025 |
| 1296.0 | 0.024 |
| 1295.0 | 0.021 |
| 1294.0 | 0.024 |
| 1293.0 | 0.024 |
| 1292.0 | 0.024 |
| 1291.0 | 0.021 |
| 1290.0 | 0.023 |
| 1289.0 | 0.024 |
| 1288.0 | 0.021 |
| 1287.0 | 0.022 |
| 1286.0 | 0.02 |
| 1285.0 | 0.021 |
| 1284.0 | 0.021 |
| 1283.0 | 0.021 |
| 1282.0 | 0.021 |
| 1281.0 | 0.02 |
| 1280.0 | 0.02 |
| 1279.0 | 0.017 |
| 1278.0 | 0.021 |
| 1277.0 | 0.021 |
| 1276.0 | 0.018 |
| 1275.0 | 0.022 |
| 1274.0 | 0.02 |
| 1273.0 | 0.019 |
| 1272.0 | 0.018 |
| 1271.0 | 0.022 |
| 1270.0 | 0.02 |
| 1269.0 | 0.018 |
| 1268.0 | 0.022 |
| 1267.0 | 0.019 |
| 1266.0 | 0.018 |
| 1265.0 | 0.017 |
| 1264.0 | 0.019 |
| 1263.0 | 0.019 |
| 1262.0 | 0.02 |
| 1261.0 | 0.019 |
| 1260.0 | 0.02 |
| 1259.0 | 0.019 |
| 1258.0 | 0.022 |
| 1257.0 | 0.021 |
| 1256.0 | 0.018 |
| 1255.0 | 0.016 |
| 1254.0 | 0.021 |
| 1253.0 | 0.02 |
| 1252.0 | 0.021 |
| 1251.0 | 0.02 |
| 1250.0 | 0.019 |
| 1249.0 | 0.019 |
| 1248.0 | 0.018 |
| 1247.0 | 0.018 |
| 1246.0 | 0.017 |
| 1245.0 | 0.015 |
| 1244.0 | 0.02 |
| 1243.0 | 0.019 |
| 1242.0 | 0.021 |
| 1241.0 | 0.019 |
| 1240.0 | 0.02 |
| 1239.0 | 0.016 |
| 1238.0 | 0.021 |
| 1237.0 | 0.018 |
| 1236.0 | 0.019 |
| 1235.0 | 0.017 |
| 1234.0 | 0.02 |
| 1233.0 | 0.016 |
| 1232.0 | 0.018 |
| 1231.0 | 0.017 |
| 1230.0 | 0.018 |
| 1229.0 | 0.017 |
| 1228.0 | 0.018 |
| 1227.0 | 0.017 |
| 1226.0 | 0.017 |
| 1225.0 | 0.016 |
| 1224.0 | 0.016 |
| 1223.0 | 0.016 |
| 1222.0 | 0.018 |
| 1221.0 | 0.017 |
| 1220.0 | 0.016 |
| 1219.0 | 0.019 |
| 1218.0 | 0.019 |
| 1217.0 | 0.017 |
| 1216.0 | 0.017 |
| 1215.0 | 0.02 |
| 1214.0 | 0.018 |
| 1213.0 | 0.018 |
| 1212.0 | 0.018 |
| 1211.0 | 0.016 |
| 1210.0 | 0.015 |
| 1209.0 | 0.017 |
| 1208.0 | 0.02 |
| 1207.0 | 0.015 |
| 1206.0 | 0.019 |
| 1205.0 | 0.018 |
| 1204.0 | 0.019 |
| 1203.0 | 0.021 |
| 1202.0 | 0.019 |
| 1201.0 | 0.015 |
| 1200.0 | 0.018 |
| 1199.0 | 0.024 |
| 1198.0 | 0.02 |
| 1197.0 | 0.021 |
| 1196.0 | 0.018 |
| 1195.0 | 0.018 |
| 1194.0 | 0.017 |
| 1193.0 | 0.018 |
| 1192.0 | 0.018 |
| 1191.0 | 0.017 |
| 1190.0 | 0.021 |
| 1189.0 | 0.019 |
| 1188.0 | 0.019 |
| 1187.0 | 0.019 |
| 1186.0 | 0.019 |
| 1185.0 | 0.016 |
| 1184.0 | 0.019 |
| 1183.0 | 0.017 |
| 1182.0 | 0.018 |
| 1181.0 | 0.016 |
| 1180.0 | 0.019 |
| 1179.0 | 0.019 |
| 1178.0 | 0.017 |
| 1177.0 | 0.015 |
| 1176.0 | 0.016 |
| 1175.0 | 0.018 |
| 1174.0 | 0.016 |
| 1173.0 | 0.016 |
| 1172.0 | 0.017 |
| 1171.0 | 0.015 |
| 1170.0 | 0.016 |
| 1169.0 | 0.018 |
| 1168.0 | 0.018 |
| 1167.0 | 0.019 |
| 1166.0 | 0.016 |
| 1165.0 | 0.021 |
| 1164.0 | 0.018 |
| 1163.0 | 0.02 |
| 1162.0 | 0.018 |
| 1161.0 | 0.017 |
| 1160.0 | 0.018 |
| 1159.0 | 0.018 |
| 1158.0 | 0.017 |
| 1157.0 | 0.017 |
| 1156.0 | 0.015 |
| 1155.0 | 0.017 |
| 1154.0 | 0.018 |
| 1153.0 | 0.018 |
| 1152.0 | 0.02 |
| 1151.0 | 0.017 |
| 1150.0 | 0.019 |
| 1149.0 | 0.016 |
| 1148.0 | 0.018 |
| 1147.0 | 0.021 |
| 1146.0 | 0.019 |
| 1145.0 | 0.019 |
| 1144.0 | 0.017 |
| 1143.0 | 0.019 |
| 1142.0 | 0.018 |
| 1141.0 | 0.017 |
| 1140.0 | 0.019 |
| 1139.0 | 0.017 |
| 1138.0 | 0.017 |
| 1137.0 | 0.016 |
| 1136.0 | 0.018 |
| 1135.0 | 0.018 |
| 1134.0 | 0.018 |
| 1133.0 | 0.018 |
| 1132.0 | 0.017 |
| 1131.0 | 0.017 |
| 1130.0 | 0.017 |
| 1129.0 | 0.017 |
| 1128.0 | 0.016 |
| 1127.0 | 0.017 |
| 1126.0 | 0.018 |
| 1125.0 | 0.019 |
| 1124.0 | 0.018 |
| 1123.0 | 0.018 |
| 1122.0 | 0.017 |
| 1121.0 | 0.019 |
| 1120.0 | 0.018 |
| 1119.0 | 0.017 |
| 1118.0 | 0.017 |
| 1117.0 | 0.019 |
| 1116.0 | 0.017 |
| 1115.0 | 0.015 |
| 1114.0 | 0.018 |
| 1113.0 | 0.018 |
| 1112.0 | 0.017 |
| 1111.0 | 0.015 |
| 1110.0 | 0.018 |
| 1109.0 | 0.017 |
| 1108.0 | 0.016 |
| 1107.0 | 0.017 |
| 1106.0 | 0.018 |
| 1105.0 | 0.018 |
| 1104.0 | 0.017 |
| 1103.0 | 0.02 |
| 1102.0 | 0.017 |
| 1101.0 | 0.018 |
| 1100.0 | 0.017 |
| 1099.0 | 0.016 |
| 1098.0 | 0.018 |
| 1097.0 | 0.014 |
| 1096.0 | 0.018 |
| 1095.0 | 0.02 |
| 1094.0 | 0.017 |
| 1093.0 | 0.017 |
| 1092.0 | 0.018 |
| 1091.0 | 0.02 |
| 1090.0 | 0.02 |
| 1089.0 | 0.017 |
| 1088.0 | 0.013 |
| 1087.0 | 0.017 |
| 1086.0 | 0.015 |
| 1085.0 | 0.017 |
| 1084.0 | 0.017 |
| 1083.0 | 0.019 |
| 1082.0 | 0.018 |
| 1081.0 | 0.018 |
| 1080.0 | 0.017 |
| 1079.0 | 0.017 |
| 1078.0 | 0.016 |
| 1077.0 | 0.019 |
| 1076.0 | 0.019 |
| 1075.0 | 0.018 |
| 1074.0 | 0.018 |
| 1073.0 | 0.019 |
| 1072.0 | 0.019 |
| 1071.0 | 0.018 |
| 1070.0 | 0.017 |
| 1069.0 | 0.017 |
| 1068.0 | 0.017 |
| 1067.0 | 0.017 |
| 1066.0 | 0.016 |
| 1065.0 | 0.016 |
| 1064.0 | 0.018 |
| 1063.0 | 0.018 |
| 1062.0 | 0.018 |
| 1061.0 | 0.018 |
| 1060.0 | 0.018 |
| 1059.0 | 0.019 |
| 1058.0 | 0.015 |
| 1057.0 | 0.017 |
| 1056.0 | 0.017 |
| 1055.0 | 0.017 |
| 1054.0 | 0.015 |
| 1053.0 | 0.018 |
| 1052.0 | 0.016 |
| 1051.0 | 0.016 |
| 1050.0 | 0.017 |
| 1049.0 | 0.017 |
| 1048.0 | 0.017 |
| 1047.0 | 0.017 |
| 1046.0 | 0.018 |
| 1045.0 | 0.018 |
| 1044.0 | 0.018 |
| 1043.0 | 0.017 |
| 1042.0 | 0.018 |
| 1041.0 | 0.017 |
| 1040.0 | 0.017 |
| 1039.0 | 0.016 |
| 1038.0 | 0.017 |
| 1037.0 | 0.017 |
| 1036.0 | 0.019 |
| 1035.0 | 0.018 |
| 1034.0 | 0.017 |
| 1033.0 | 0.017 |
| 1032.0 | 0.017 |
| 1031.0 | 0.017 |
| 1030.0 | 0.017 |
| 1029.0 | 0.018 |
| 1028.0 | 0.018 |
| 1027.0 | 0.018 |
| 1026.0 | 0.019 |
| 1025.0 | 0.013 |
| 1024.0 | 0.018 |
| 1023.0 | 0.018 |
| 1022.0 | 0.015 |
| 1021.0 | 0.019 |
| 1020.0 | 0.017 |
| 1019.0 | 0.019 |
| 1018.0 | 0.019 |
| 1017.0 | 0.017 |
| 1016.0 | 0.015 |
| 1015.0 | 0.018 |
| 1014.0 | 0.017 |
| 1013.0 | 0.018 |
| 1012.0 | 0.018 |
| 1011.0 | 0.018 |
| 1010.0 | 0.017 |
| 1009.0 | 0.018 |
| 1008.0 | 0.017 |
| 1007.0 | 0.017 |
| 1006.0 | 0.017 |
| 1005.0 | 0.015 |
| 1004.0 | 0.018 |
| 1003.0 | 0.017 |
| 1002.0 | 0.016 |
| 1001.0 | 0.017 |
| 1000.0 | 0.019 |
| 999.0 | 0.019 |
| 998.0 | 0.018 |
| 997.0 | 0.02 |
| 996.0 | 0.019 |
| 995.0 | 0.015 |
| 994.0 | 0.016 |
| 993.0 | 0.016 |
| 992.0 | 0.018 |
| 991.0 | 0.019 |
| 990.0 | 0.018 |
| 989.0 | 0.016 |
| 988.0 | 0.017 |
| 987.0 | 0.015 |
| 986.0 | 0.016 |
| 985.0 | 0.017 |
| 984.0 | 0.017 |
| 983.0 | 0.016 |
| 982.0 | 0.015 |
| 981.0 | 0.019 |
| 980.0 | 0.017 |
| 979.0 | 0.019 |
| 978.0 | 0.02 |
| 977.0 | 0.018 |
| 976.0 | 0.017 |
| 975.0 | 0.016 |
| 974.0 | 0.02 |
| 973.0 | 0.017 |
| 972.0 | 0.02 |
| 971.0 | 0.017 |
| 970.0 | 0.015 |
| 969.0 | 0.018 |
| 968.0 | 0.019 |
| 967.0 | 0.019 |
| 966.0 | 0.016 |
| 965.0 | 0.015 |
| 964.0 | 0.016 |
| 963.0 | 0.017 |
| 962.0 | 0.018 |
| 961.0 | 0.018 |
| 960.0 | 0.018 |
| 959.0 | 0.016 |
| 958.0 | 0.016 |
| 957.0 | 0.017 |
| 956.0 | 0.014 |
| 955.0 | 0.02 |
| 954.0 | 0.018 |
| 953.0 | 0.018 |
| 952.0 | 0.017 |
| 951.0 | 0.016 |
| 950.0 | 0.016 |
| 949.0 | 0.018 |
| 948.0 | 0.018 |
| 947.0 | 0.018 |
| 946.0 | 0.017 |
| 945.0 | 0.019 |
| 944.0 | 0.017 |
| 943.0 | 0.017 |
| 942.0 | 0.016 |
| 941.0 | 0.015 |
| 940.0 | 0.017 |
| 939.0 | 0.018 |
| 938.0 | 0.017 |
| 937.0 | 0.018 |
| 936.0 | 0.017 |
| 935.0 | 0.017 |
| 934.0 | 0.017 |
| 933.0 | 0.018 |
| 932.0 | 0.018 |
| 931.0 | 0.017 |
| 930.0 | 0.018 |
| 929.0 | 0.017 |
| 928.0 | 0.018 |
| 927.0 | 0.018 |
| 926.0 | 0.016 |
| 925.0 | 0.016 |
| 924.0 | 0.016 |
| 923.0 | 0.018 |
| 922.0 | 0.019 |
| 921.0 | 0.016 |
| 920.0 | 0.017 |
| 919.0 | 0.018 |
| 918.0 | 0.017 |
| 917.0 | 0.016 |
| 916.0 | 0.017 |
| 915.0 | 0.017 |
| 914.0 | 0.019 |
| 913.0 | 0.018 |
| 912.0 | 0.016 |
| 911.0 | 0.018 |
| 910.0 | 0.02 |
| 909.0 | 0.02 |
| 908.0 | 0.019 |
| 907.0 | 0.017 |
| 906.0 | 0.021 |
| 905.0 | 0.017 |
| 904.0 | 0.016 |
| 903.0 | 0.017 |
| 902.0 | 0.018 |
| 901.0 | 0.015 |
| 900.0 | 0.017 |
| 899.0 | 0.015 |
| 898.0 | 0.016 |
| 897.0 | 0.015 |
| 896.0 | 0.021 |
| 895.0 | 0.018 |
| 894.0 | 0.02 |
| 893.0 | 0.019 |
| 892.0 | 0.015 |
| 891.0 | 0.018 |
| 890.0 | 0.016 |
| 889.0 | 0.019 |
| 888.0 | 0.017 |
| 887.0 | 0.018 |
| 886.0 | 0.018 |
| 885.0 | 0.019 |
| 884.0 | 0.018 |
| 883.0 | 0.016 |
| 882.0 | 0.02 |
| 881.0 | 0.016 |
| 880.0 | 0.018 |
| 879.0 | 0.014 |
| 878.0 | 0.018 |
| 877.0 | 0.017 |
| 876.0 | 0.02 |
| 875.0 | 0.019 |
| 874.0 | 0.017 |
| 873.0 | 0.02 |
| 872.0 | 0.018 |
| 871.0 | 0.017 |
| 870.0 | 0.02 |
| 869.0 | 0.017 |
| 868.0 | 0.018 |
| 867.0 | 0.016 |
| 866.0 | 0.015 |
| 865.0 | 0.017 |
| 864.0 | 0.019 |
| 863.0 | 0.017 |
| 862.0 | 0.017 |
| 861.0 | 0.017 |
| 860.0 | 0.018 |
| 859.0 | 0.021 |
| 858.0 | 0.018 |
| 857.0 | 0.019 |
| 856.0 | 0.019 |
| 855.0 | 0.019 |
| 854.0 | 0.018 |
| 853.0 | 0.018 |
| 852.0 | 0.015 |
| 851.0 | 0.018 |
| 850.0 | 0.018 |
| 849.0 | 0.015 |
| 848.0 | 0.02 |
| 847.0 | 0.014 |
| 846.0 | 0.018 |
| 845.0 | 0.017 |
| 844.0 | 0.018 |
| 843.0 | 0.019 |
| 842.0 | 0.02 |
| 841.0 | 0.02 |
| 840.0 | 0.017 |
| 839.0 | 0.018 |
| 838.0 | 0.016 |
| 837.0 | 0.018 |
| 836.0 | 0.017 |
| 835.0 | 0.019 |
| 834.0 | 0.016 |
| 833.0 | 0.016 |
| 832.0 | 0.017 |
| 831.0 | 0.016 |
| 830.0 | 0.019 |
| 829.0 | 0.016 |
| 828.0 | 0.016 |
| 827.0 | 0.018 |
| 826.0 | 0.016 |
| 825.0 | 0.019 |
| 824.0 | 0.017 |
| 823.0 | 0.016 |
| 822.0 | 0.016 |
| 821.0 | 0.016 |
| 820.0 | 0.016 |
| 819.0 | 0.016 |
| 818.0 | 0.017 |
| 817.0 | 0.02 |
| 816.0 | 0.015 |
| 815.0 | 0.016 |
| 814.0 | 0.019 |
| 813.0 | 0.014 |
| 812.0 | 0.018 |
| 811.0 | 0.018 |
| 810.0 | 0.017 |
| 809.0 | 0.015 |
| 808.0 | 0.015 |
| 807.0 | 0.017 |
| 806.0 | 0.014 |
| 805.0 | 0.016 |
| 804.0 | 0.017 |
| 803.0 | 0.017 |
| 802.0 | 0.018 |
| 801.0 | 0.016 |
| 800.0 | 0.016 |
| 799.0 | 0 |
| 798.0 | 0 |
| 797.0 | 0 |
| 796.0 | 0 |
| 795.0 | 0 |
| 794.0 | 0 |
| 793.0 | 0 |
| 792.0 | 0 |
| 791.0 | 0 |
| 790.0 | 0 |
| 789.0 | 0 |
| 788.0 | 0 |
| 787.0 | 0 |
| 786.0 | 0 |
| 785.0 | 0 |
| 784.0 | 0 |
| 783.0 | 0 |
| 782.0 | 0 |
| 781.0 | 0 |
| 780.0 | 0 |
| 779.0 | 0 |
| 778.0 | 0 |
| 777.0 | 0 |
| 776.0 | 0 |
| 775.0 | 0 |
| 774.0 | 0 |
| 773.0 | 0 |
| 772.0 | 0 |
| 771.0 | 0 |
| 770.0 | 0 |
| 769.0 | 0 |
| 768.0 | 0 |
| 767.0 | 0 |
| 766.0 | 0 |
| 765.0 | 0 |
| 764.0 | 0 |
| 763.0 | 0 |
| 762.0 | 0 |
| 761.0 | 0 |
| 760.0 | 0 |
| 759.0 | 0 |
| 758.0 | 0 |
| 757.0 | 0 |
| 756.0 | 0 |
| 755.0 | 0 |
| 754.0 | 0 |
| 753.0 | 0 |
| 752.0 | 0 |
| 751.0 | 0 |
| 750.0 | 0 |
| 749.0 | 0 |
| 748.0 | 0 |
| 747.0 | 0 |
| 746.0 | 0 |
| 745.0 | 0 |
| 744.0 | 0 |
| 743.0 | 0 |
| 742.0 | 0 |
| 741.0 | 0 |
| 740.0 | 0 |
| 739.0 | 0 |
| 738.0 | 0 |
| 737.0 | 0 |
| 736.0 | 0 |
| 735.0 | 0 |
| 734.0 | 0 |
| 733.0 | 0 |
| 732.0 | 0 |
| 731.0 | 0 |
| 730.0 | 0 |
| 729.0 | 0 |
| 728.0 | 0 |
| 727.0 | 0 |
| 726.0 | 0 |
| 725.0 | 0 |
| 724.0 | 0 |
| 723.0 | 0 |
| 722.0 | 0 |
| 721.0 | 0 |
| 720.0 | 0 |
| 719.0 | 0 |
| 718.0 | 0 |
| 717.0 | 0 |
| 716.0 | 0 |
| 715.0 | 0 |
| 714.0 | 0 |
| 713.0 | 0 |
| 712.0 | 0 |
| 711.0 | 0 |
| 710.0 | 0 |
| 709.0 | 0 |
| 708.0 | 0 |
| 707.0 | 0 |
| 706.0 | 0 |
| 705.0 | 0 |
| 704.0 | 0 |
| 703.0 | 0 |
| 702.0 | 0 |
| 701.0 | 0 |
| 700.0 | 0 |
| 699.0 | 0 |
| 698.0 | 0 |
| 697.0 | 0 |
| 696.0 | 0 |
| 695.0 | 0 |
| 694.0 | 0 |
| 693.0 | 0 |
| 692.0 | 0 |
| 691.0 | 0 |
| 690.0 | 0 |
| 689.0 | 0 |
| 688.0 | 0 |
| 687.0 | 0 |
| 686.0 | 0 |
| 685.0 | 0 |
| 684.0 | 0 |
| 683.0 | 0 |
| 682.0 | 0 |
| 681.0 | 0 |
| 680.0 | 0 |
| 679.0 | 0 |
| 678.0 | 0 |
| 677.0 | 0 |
| 676.0 | 0 |
| 675.0 | 0 |
| 674.0 | 0 |
| 673.0 | 0 |
| 672.0 | 0 |
| 671.0 | 0 |
| 670.0 | 0 |
| 669.0 | 0 |
| 668.0 | 0 |
| 667.0 | 0 |
| 666.0 | 0 |
| 665.0 | 0 |
| 664.0 | 0 |
| 663.0 | 0 |
| 662.0 | 0 |
| 661.0 | 0 |
| 660.0 | 0 |
| 659.0 | 0 |
| 658.0 | 0 |
| 657.0 | 0 |
| 656.0 | 0 |
| 655.0 | 0 |
| 654.0 | 0 |
| 653.0 | 0 |
| 652.0 | 0 |
| 651.0 | 0 |
| 650.0 | 0 |
| 649.0 | 0 |
| 648.0 | 0 |
| 647.0 | 0 |
| 646.0 | 0 |
| 645.0 | 0 |
| 644.0 | 0 |
| 643.0 | 0 |
| 642.0 | 0 |
| 641.0 | 0 |
| 640.0 | 0 |
| 639.0 | 0 |
| 638.0 | 0 |
| 637.0 | 0 |
| 636.0 | 0 |
| 635.0 | 0 |
| 634.0 | 0 |
| 633.0 | 0 |
| 632.0 | 0 |
| 631.0 | 0 |
| 630.0 | 0 |
| 629.0 | 0 |
| 628.0 | 0 |
| 627.0 | 0 |
| 626.0 | 0 |
| 625.0 | 0 |
| 624.0 | 0 |
| 623.0 | 0 |
| 622.0 | 0 |
| 621.0 | 0 |
| 620.0 | 0 |
| 619.0 | 0 |
| 618.0 | 0 |
| 617.0 | 0 |
| 616.0 | 0 |
| 615.0 | 0 |
| 614.0 | 0 |
| 613.0 | 0 |
| 612.0 | 0 |
| 611.0 | 0 |
| 610.0 | 0.001 |
| 609.0 | 0 |
| 608.0 | 0.001 |
| 607.0 | 0.001 |
| 606.0 | 0.001 |
| 605.0 | 0.002 |
| 604.0 | 0.002 |
| 603.0 | 0.002 |
| 602.0 | 0.002 |
| 601.0 | 0.001 |
| 600.0 | 0.001 |
| 599.0 | 0.001 |
| 598.0 | 0 |
| 597.0 | 0 |
| 596.0 | 0 |
| 595.0 | 0 |
| 594.0 | 0 |
| 593.0 | 0 |
| 592.0 | 0 |
| 591.0 | 0 |
| 590.0 | 0 |
| 589.0 | 0 |
| 588.0 | 0 |
| 587.0 | 0 |
| 586.0 | 0 |
| 585.0 | 0 |
| 584.0 | 0 |
| 583.0 | 0 |
| 582.0 | 0 |
| 581.0 | 0 |
| 580.0 | 0 |
| 579.0 | 0 |
| 578.0 | 0 |
| 577.0 | 0 |
| 576.0 | 0 |
| 575.0 | 0 |
| 574.0 | 0 |
| 573.0 | 0 |
| 572.0 | 0 |
| 571.0 | 0 |
| 570.0 | 0 |
| 569.0 | 0 |
| 568.0 | 0 |
| 567.0 | 0 |
| 566.0 | 0 |
| 565.0 | 0 |
| 564.0 | 0 |
| 563.0 | 0 |
| 562.0 | 0 |
| 561.0 | 0 |
| 560.0 | 0 |
| 559.0 | 0 |
| 558.0 | 0 |
| 557.0 | 0 |
| 556.0 | 0 |
| 555.0 | 0 |
| 554.0 | 0 |
| 553.0 | 0 |
| 552.0 | 0 |
| 551.0 | 0 |
| 550.0 | 0 |
| 549.0 | 0 |
| 548.0 | 0.001 |
| 547.0 | 0 |
| 546.0 | 0.001 |
| 545.0 | 0.001 |
| 544.0 | 0.001 |
| 543.0 | 0.001 |
| 542.0 | 0.001 |
| 541.0 | 0.001 |
| 540.0 | 0.001 |
| 539.0 | 0.002 |
| 538.0 | 0.001 |
| 537.0 | 0.002 |
| 536.0 | 0.002 |
| 535.0 | 0.002 |
| 534.0 | 0.002 |
| 533.0 | 0.002 |
| 532.0 | 0.002 |
| 531.0 | 0.002 |
| 530.0 | 0.002 |
| 529.0 | 0.002 |
| 528.0 | 0.002 |
| 527.0 | 0.002 |
| 526.0 | 0.002 |
| 525.0 | 0.003 |
| 524.0 | 0.003 |
| 523.0 | 0.003 |
| 522.0 | 0.003 |
| 521.0 | 0.003 |
| 520.0 | 0.004 |
| 519.0 | 0.004 |
| 518.0 | 0.004 |
| 517.0 | 0.005 |
| 516.0 | 0.006 |
| 515.0 | 0.006 |
| 514.0 | 0.007 |
| 513.0 | 0.008 |
| 512.0 | 0.01 |
| 511.0 | 0.012 |
| 510.0 | 0.014 |
| 509.0 | 0.017 |
| 508.0 | 0.022 |
| 507.0 | 0.028 |
| 506.0 | 0.036 |
| 505.0 | 0.047 |
| 504.0 | 0.065 |
| 503.0 | 0.09 |
| 502.0 | 0.13 |
| 501.0 | 0.195 |
| 500.0 | 0.303 |
| 499.0 | 0.498 |
| 498.0 | 0.866 |
| 497.0 | 1.594 |
| 496.0 | 3.173 |
| 495.0 | 6.614 |
| 494.0 | 13.628 |
| 493.0 | 25.558 |
| 492.0 | 40.685 |
| 491.0 | 54.703 |
| 490.0 | 63.943 |
| 489.0 | 68.861 |
| 488.0 | 71.4 |
| 487.0 | 72.178 |
| 486.0 | 70.954 |
| 485.0 | 67.478 |
| 484.0 | 60.777 |
| 483.0 | 49.141 |
| 482.0 | 33.807 |
| 481.0 | 19.224 |
| 480.0 | 9.312 |
| 479.0 | 4.224 |
| 478.0 | 1.959 |
| 477.0 | 0.972 |
| 476.0 | 0.524 |
| 475.0 | 0.3 |
| 474.0 | 0.182 |
| 473.0 | 0.115 |
| 472.0 | 0.076 |
| 471.0 | 0.052 |
| 470.0 | 0.036 |
| 469.0 | 0.026 |
| 468.0 | 0.019 |
| 467.0 | 0.014 |
| 466.0 | 0.011 |
| 465.0 | 0.008 |
| 464.0 | 0.007 |
| 463.0 | 0.005 |
| 462.0 | 0.005 |
| 461.0 | 0.004 |
| 460.0 | 0.003 |
| 459.0 | 0.003 |
| 458.0 | 0.003 |
| 457.0 | 0.002 |
| 456.0 | 0.002 |
| 455.0 | 0.002 |
| 454.0 | 0.002 |
| 453.0 | 0.001 |
| 452.0 | 0.001 |
| 451.0 | 0.001 |
| 450.0 | 0 |
| 449.0 | 0 |
| 448.0 | 0 |
| 447.0 | 0 |
| 446.0 | 0 |
| 445.0 | 0 |
| 444.0 | 0 |
| 443.0 | 0 |
| 442.0 | 0 |
| 441.0 | 0 |
| 440.0 | 0 |
| 439.0 | 0 |
| 438.0 | 0 |
| 437.0 | 0 |
| 436.0 | 0 |
| 435.0 | 0 |
| 434.0 | 0 |
| 433.0 | 0 |
| 432.0 | 0 |
| 431.0 | 0 |
| 430.0 | 0 |
| 429.0 | 0 |
| 428.0 | 0 |
| 427.0 | 0 |
| 426.0 | 0 |
| 425.0 | 0 |
| 424.0 | 0 |
| 423.0 | 0 |
| 422.0 | 0 |
| 421.0 | 0 |
| 420.0 | 0 |
| 419.0 | 0 |
| 418.0 | 0 |
| 417.0 | 0 |
| 416.0 | 0 |
| 415.0 | 0 |
| 414.0 | 0 |
| 413.0 | 0 |
| 412.0 | 0 |
| 411.0 | 0 |
| 410.0 | 0 |
| 409.0 | 0 |
| 408.0 | 0 |
| 407.0 | 0 |
| 406.0 | 0 |
| 405.0 | 0 |
| 404.0 | 0 |
| 403.0 | 0 |
| 402.0 | 0 |
| 401.0 | 0 |
| 400.0 | 0 |
| 399.0 | 0 |
| 398.0 | 0 |
| 397.0 | 0 |
| 396.0 | 0 |
| 395.0 | 0 |
| 394.0 | 0 |
| 393.0 | 0 |
| 392.0 | 0 |
| 391.0 | 0 |
| 390.0 | 0 |
| 389.0 | 0 |
| 388.0 | 0 |
| 387.0 | 0 |
| 386.0 | 0 |
| 385.0 | 0 |
| 384.0 | 0 |
| 383.0 | 0 |
| 382.0 | 0 |
| 381.0 | 0 |
| 380.0 | 0 |
| 379.0 | 0 |
| 378.0 | 0 |
| 377.0 | 0 |
| 376.0 | 0 |
| 375.0 | 0.001 |
| 374.0 | 0.001 |
| 373.0 | 0.001 |
| 372.0 | 0.001 |
| 371.0 | 0.002 |
| 370.0 | 0.002 |
| 369.0 | 0.001 |
| 368.0 | 0.001 |
| 367.0 | 0.001 |
| 366.0 | 0.001 |
| 365.0 | 0.001 |
| 364.0 | 0 |
| 363.0 | 0.001 |
| 362.0 | 0 |
| 361.0 | 0 |
| 360.0 | 0 |
| 359.0 | 0 |
| 358.0 | 0 |
| 357.0 | 0 |
| 356.0 | 0 |
| 355.0 | 0 |
| 354.0 | 0 |
| 353.0 | 0 |
| 352.0 | 0 |
| 351.0 | 0 |
| 350.0 | 0 |
| 349.0 | 0.001 |
| 348.0 | 0 |
| 347.0 | 0 |
| 346.0 | 0 |
| 345.0 | 0 |
| 344.0 | 0 |
| 343.0 | 0 |
| 342.0 | 0 |
| 341.0 | 0 |
| 340.0 | 0 |
| 339.0 | 0 |
| 338.0 | 0 |
| 337.0 | 0 |
| 336.0 | 0 |
| 335.0 | 0 |
| 334.0 | 0 |
| 333.0 | 0 |
| 332.0 | 0 |
| 331.0 | 0 |
| 330.0 | 0 |
| 329.0 | 0 |
| 328.0 | 0 |
| 327.0 | 0 |
| 326.0 | 0 |
| 325.0 | 0 |
| 324.0 | 0 |
| 323.0 | 0 |
| 322.0 | 0 |
| 321.0 | 0 |
| 320.0 | 0 |
| 319.0 | 0 |
| 318.0 | 0 |
| 317.0 | 0 |
| 316.0 | 0 |
| 315.0 | 0 |
| 314.0 | 0 |
| 313.0 | 0 |
| 312.0 | 0 |
| 311.0 | 0 |
| 310.0 | 0 |
| 309.0 | 0 |
| 308.0 | 0 |
| 307.0 | 0 |
| 306.0 | 0 |
| 305.0 | 0 |
| 304.0 | 0 |
| 303.0 | 0 |
| 302.0 | 0 |
| 301.0 | 0 |
| 300.0 | 0 |
| 299.0 | 0 |
| 298.0 | 0 |
| 297.0 | 0 |
| 296.0 | 0 |
| 295.0 | 0 |
| 294.0 | 0 |
| 293.0 | 0 |
| 292.0 | 0 |
| 291.0 | 0 |
| 290.0 | 0 |
| 289.0 | 0 |
| 288.0 | 0 |
| 287.0 | 0 |
| 286.0 | 0 |
| 285.0 | 0 |
| 284.0 | 0 |
| 283.0 | 0 |
| 282.0 | 0 |
| 281.0 | 0 |
| 280.0 | 0 |
| 279.0 | 0 |
| 278.0 | 0 |
| 277.0 | 0 |
| 276.0 | 0 |
| 275.0 | 0 |
| 274.0 | 0 |
| 273.0 | 0 |
| 272.0 | 0 |
| 271.0 | 0 |
| 270.0 | 0 |
| 269.0 | 0 |
| 268.0 | 0 |
| 267.0 | 0 |
| 266.0 | 0 |
| 265.0 | 0 |
| 264.0 | 0 |
| 263.0 | 0 |
| 262.0 | 0 |
| 261.0 | 0 |
| 260.0 | 0 |
| 259.0 | 0 |
| 258.0 | 0 |
| 257.0 | 0 |
| 256.0 | 0 |
| 255.0 | 0 |
| 254.0 | 0 |
| 253.0 | 0 |
| 252.0 | 0 |
| 251.0 | 0 |
| 250.0 | 0 |
| 249.0 | 0 |
| 248.0 | 0 |
| 247.0 | 0 |
| 246.0 | 0 |
| 245.0 | 0 |
| 244.0 | 0 |
| 243.0 | 0 |
| 242.0 | 0 |
| 241.0 | 0 |
| 240.0 | 0 |
| 239.0 | 0 |
| 238.0 | 0 |
| 237.0 | 0 |
| 236.0 | 0 |
| 235.0 | 0 |
| 234.0 | 0 |
| 233.0 | 0 |
| 232.0 | 0 |
| 231.0 | 0 |
| 230.0 | 0 |
| 229.0 | 0 |
| 228.0 | 0 |
| 227.0 | 0 |
| 226.0 | 0.001 |
| 225.0 | 0 |
| 224.0 | 0 |
| 223.0 | 0 |
| 222.0 | 0 |
| 221.0 | 0 |
| 220.0 | 0 |
| 219.0 | 0 |
| 218.0 | 0 |
| 217.0 | 0 |
| 216.0 | 0 |
| 215.0 | 0 |
| 214.0 | 0 |
| 213.0 | 0 |
| 212.0 | 0 |
| 211.0 | 0 |
| 210.0 | 0 |
| 209.0 | 0 |
| 208.0 | 0 |
| 207.0 | 0 |
| 206.0 | 0 |
| 205.0 | 0 |
| 204.0 | 0 |
| 203.0 | 0 |
| 202.0 | 0 |
| 201.0 | 0 |